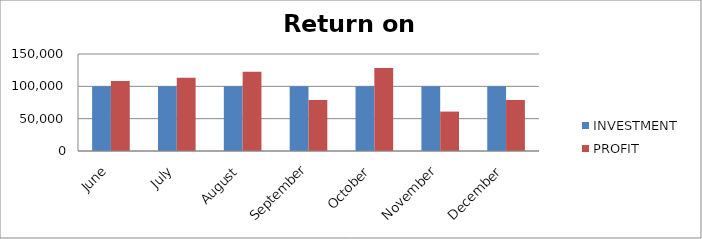
| Category | INVESTMENT  | PROFIT |
|---|---|---|
| June | 100000 | 108434 |
| July | 100000 | 113164 |
| August | 100000 | 122577 |
| September | 100000 | 78963 |
| October | 100000 | 128482 |
| November | 100000 | 60935 |
| December | 100000 | 78969 |